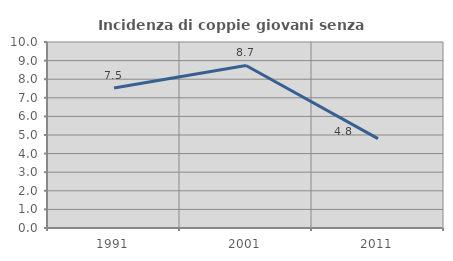
| Category | Incidenza di coppie giovani senza figli |
|---|---|
| 1991.0 | 7.531 |
| 2001.0 | 8.738 |
| 2011.0 | 4.808 |